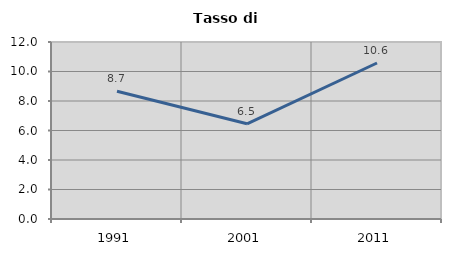
| Category | Tasso di disoccupazione   |
|---|---|
| 1991.0 | 8.657 |
| 2001.0 | 6.456 |
| 2011.0 | 10.577 |